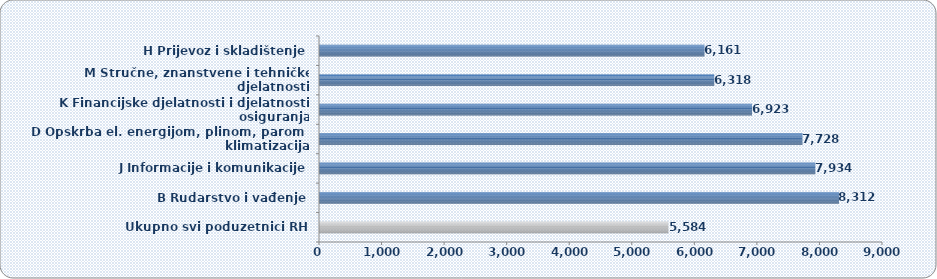
| Category | Prosječna mj.neto plaća  |
|---|---|
| Ukupno svi poduzetnici RH | 5584 |
| B Rudarstvo i vađenje | 8312.269 |
| J Informacije i komunikacije | 7933.668 |
| D Opskrba el. energijom, plinom, parom i klimatizacija | 7728.036 |
| K Financijske djelatnosti i djelatnosti osiguranja | 6922.82 |
| M Stručne, znanstvene i tehničke djelatnosti | 6317.991 |
| H Prijevoz i skladištenje | 6161.369 |